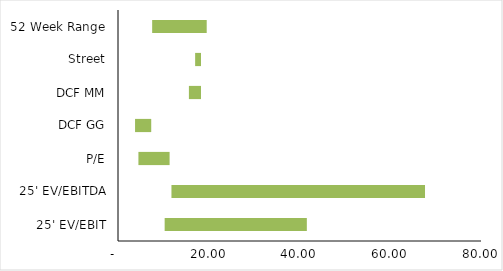
| Category | Q1 | Spread | Q3 |
|---|---|---|---|
| 25' EV/EBIT | 10.282 | 31.335 | 41.617 |
| 25' EV/EBITDA | 11.78 | 55.881 | 67.66 |
| P/E | 4.501 | 6.871 | 11.372 |
| DCF GG | 3.757 | 3.565 | 7.322 |
| DCF MM | 15.627 | 2.672 | 18.298 |
| Street | 17 | 1.298 | 18.298 |
| 52 Week Range | 7.53 | 12.02 | 19.55 |